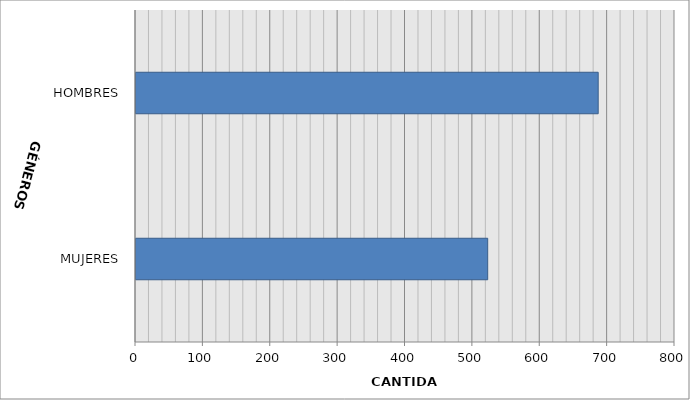
| Category | Series 0 |
|---|---|
| MUJERES | 522 |
| HOMBRES | 686 |